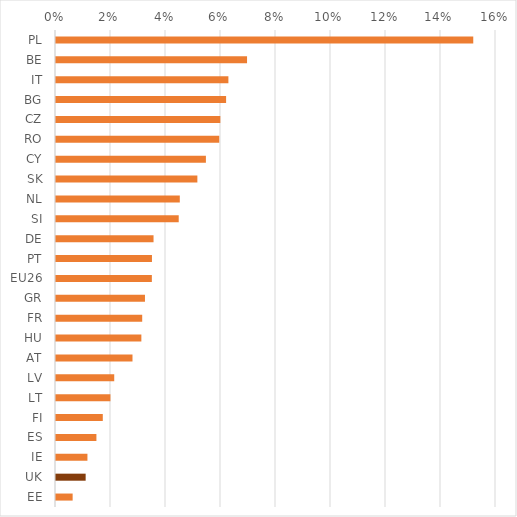
| Category | Series 0 |
|---|---|
| PL | 0.152 |
| BE | 0.069 |
| IT | 0.063 |
| BG | 0.062 |
| CZ | 0.06 |
| RO | 0.059 |
| CY | 0.055 |
| SK | 0.051 |
| NL | 0.045 |
| SI | 0.045 |
| DE | 0.035 |
| PT | 0.035 |
| EU26 | 0.035 |
| GR | 0.032 |
| FR | 0.031 |
| HU | 0.031 |
| AT | 0.028 |
| LV | 0.021 |
| LT | 0.02 |
| FI | 0.017 |
| ES | 0.015 |
| IE | 0.011 |
| UK | 0.011 |
| EE | 0.006 |